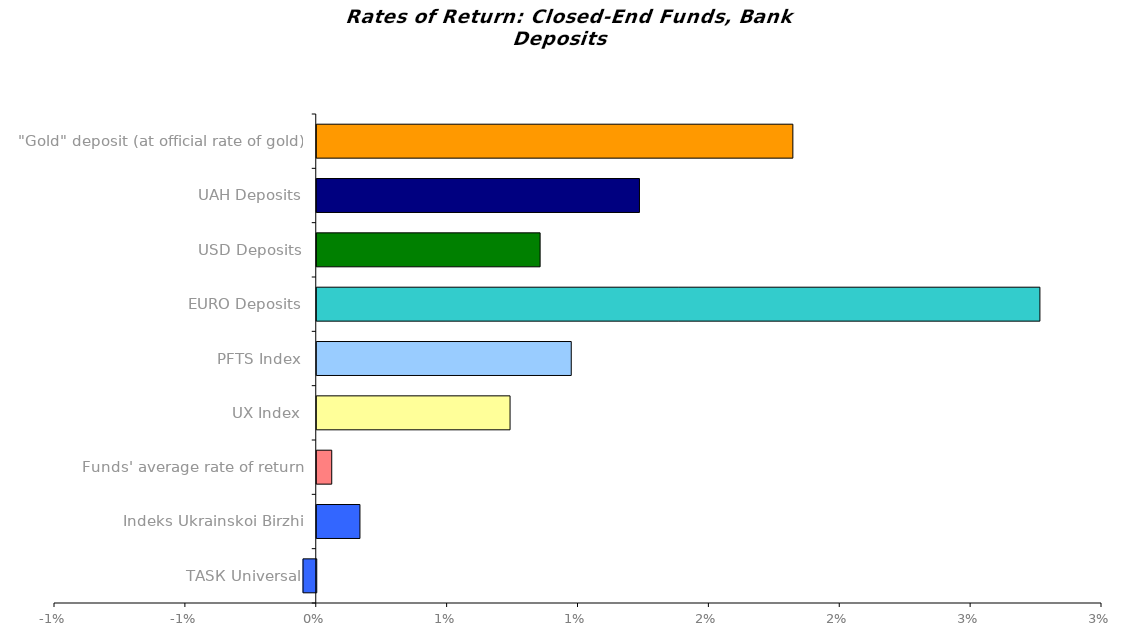
| Category | Series 0 |
|---|---|
| ТАSК Universal | -0.001 |
| Іndeks Ukrainskoi Birzhi | 0.002 |
| Funds' average rate of return | 0.001 |
| UX Index | 0.007 |
| PFTS Index | 0.01 |
| EURO Deposits | 0.028 |
| USD Deposits | 0.009 |
| UAH Deposits | 0.012 |
| "Gold" deposit (at official rate of gold) | 0.018 |